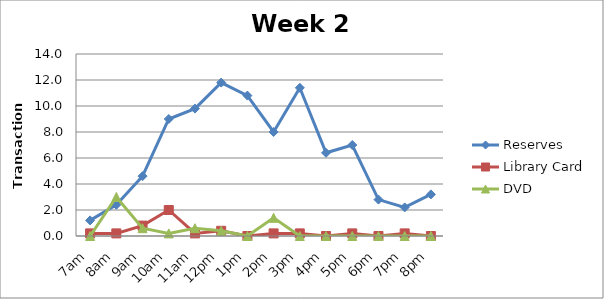
| Category | Reserves | Library Card | DVD |
|---|---|---|---|
| 7am | 1.2 | 0.2 | 0 |
| 8am | 2.4 | 0.2 | 3 |
| 9am | 4.6 | 0.8 | 0.6 |
| 10am | 9 | 2 | 0.2 |
| 11am | 9.8 | 0.2 | 0.6 |
| 12pm | 11.8 | 0.4 | 0.4 |
| 1pm | 10.8 | 0 | 0 |
| 2pm | 8 | 0.2 | 1.4 |
| 3pm | 11.4 | 0.2 | 0 |
| 4pm | 6.4 | 0 | 0 |
| 5pm | 7 | 0.2 | 0 |
| 6pm | 2.8 | 0 | 0 |
| 7pm | 2.2 | 0.2 | 0 |
| 8pm | 3.2 | 0 | 0 |